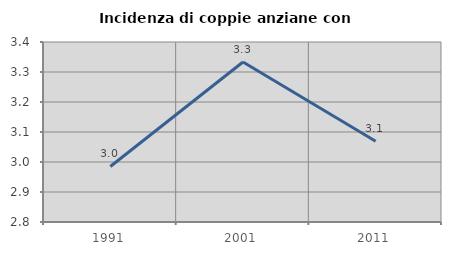
| Category | Incidenza di coppie anziane con figli |
|---|---|
| 1991.0 | 2.985 |
| 2001.0 | 3.333 |
| 2011.0 | 3.069 |